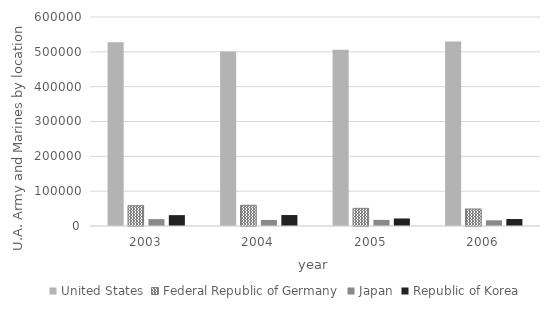
| Category | United States | Federal Republic of Germany | Japan | Republic of Korea |
|---|---|---|---|---|
| 2003.0 | 527511 | 58290 | 19790 | 31192 |
| 2004.0 | 500908 | 59523 | 17323 | 31482 |
| 2005.0 | 506006 | 50672 | 17591 | 21613 |
| 2006.0 | 529432 | 48852 | 16389 | 19997 |